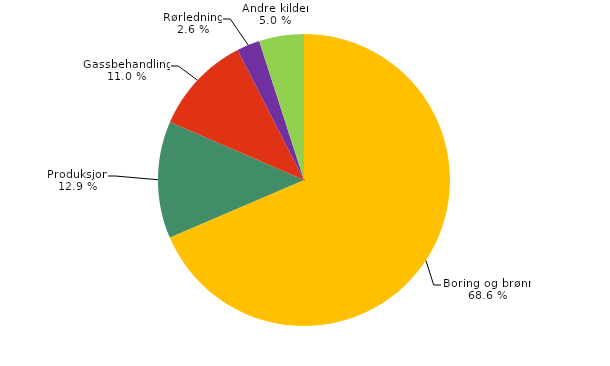
| Category | Series 0 |
|---|---|
| Boring og brønn | 107.939 |
| Produksjon | 20.365 |
| Gassbehandling | 17.302 |
| Rørledning | 4.015 |
| Andre kilder | 7.82 |